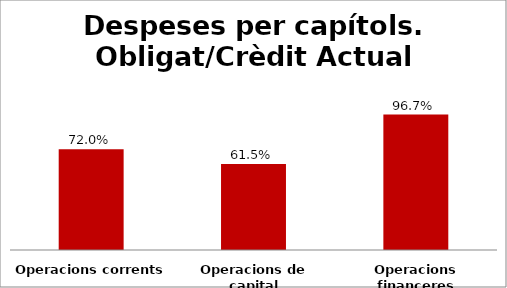
| Category | Series 0 |
|---|---|
| Operacions corrents | 0.72 |
| Operacions de capital | 0.615 |
| Operacions financeres | 0.967 |